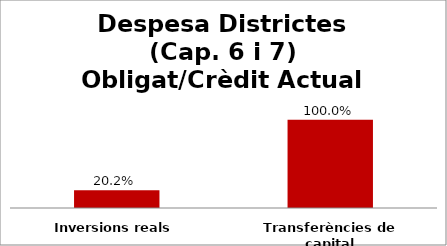
| Category | Series 0 |
|---|---|
| Inversions reals | 0.202 |
| Transferències de capital | 1 |